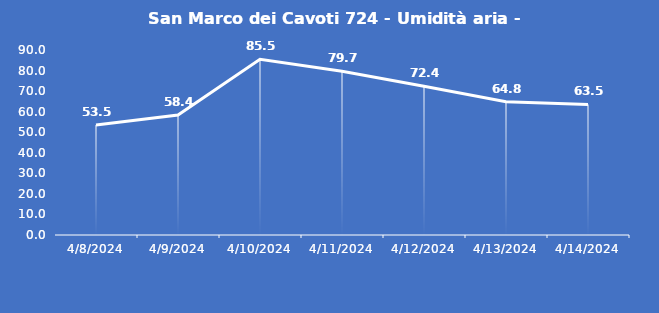
| Category | San Marco dei Cavoti 724 - Umidità aria - Grezzo (%) |
|---|---|
| 4/8/24 | 53.5 |
| 4/9/24 | 58.4 |
| 4/10/24 | 85.5 |
| 4/11/24 | 79.7 |
| 4/12/24 | 72.4 |
| 4/13/24 | 64.8 |
| 4/14/24 | 63.5 |